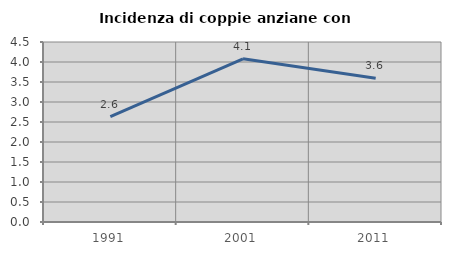
| Category | Incidenza di coppie anziane con figli |
|---|---|
| 1991.0 | 2.637 |
| 2001.0 | 4.079 |
| 2011.0 | 3.594 |